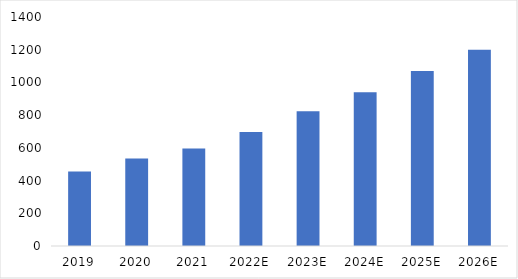
| Category | Series 0 |
|---|---|
| 2019 | 455.95 |
| 2020 | 534.756 |
| 2021 | 595.886 |
| 2022E | 696.753 |
| 2023E | 823.822 |
| 2024E | 940.058 |
| 2025E | 1070.543 |
| 2026E | 1200.232 |